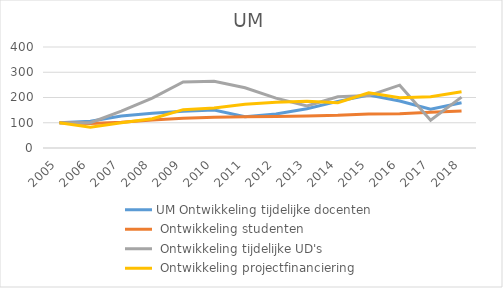
| Category | UM Ontwikkeling tijdelijke docenten | UM Ontwikkeling studenten | UM Ontwikkeling tijdelijke UD's | UM Ontwikkeling projectfinanciering |
|---|---|---|---|---|
| 2005.0 | 100 | 100 | 100 | 100 |
| 2006.0 | 105.556 | 97.326 | 100 | 82.665 |
| 2007.0 | 126.389 | 102.214 | 146.154 | 99.766 |
| 2008.0 | 137.5 | 110.493 | 197.436 | 115.833 |
| 2009.0 | 145.833 | 117.784 | 261.538 | 151.837 |
| 2010.0 | 150 | 121.301 | 264.103 | 158.143 |
| 2011.0 | 123.611 | 124.163 | 238.462 | 173.414 |
| 2012.0 | 134.722 | 124.768 | 197.436 | 181.614 |
| 2013.0 | 155.556 | 126.863 | 166.667 | 185.353 |
| 2014.0 | 184.722 | 129.469 | 202.564 | 179.514 |
| 2015.0 | 209.722 | 135.091 | 207.692 | 218.554 |
| 2016.0 | 186.111 | 136.104 | 248.718 | 199.179 |
| 2017.0 | 153.806 | 141.317 | 109.949 | 203.379 |
| 2018.0 | 178.889 | 146.444 | 201.513 | 222.378 |